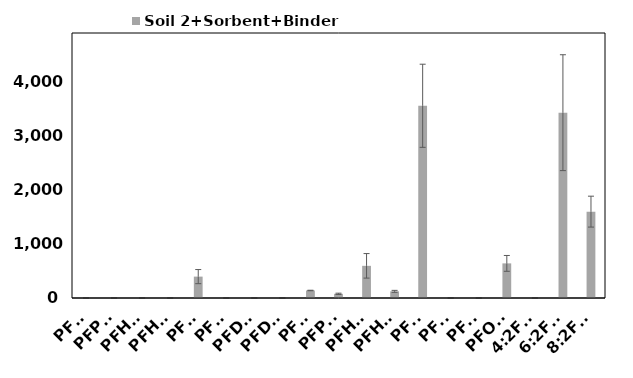
| Category | Soil 2+Sorbent+Binder |
|---|---|
| PFBA | 0 |
| PFPeA | 0 |
| PFHxA | 0 |
| PFHpA | 0 |
| PFOA | 395.364 |
| PFNA | 0 |
| PFDA | 0 |
| PFDoA | 0 |
| PFBS | 138.78 |
| PFPeS | 77.537 |
| PFHxS | 594.71 |
| PFHpS | 123.27 |
| PFOS | 3554.431 |
| PFNS | 0 |
| PFDS | 0 |
| PFOSA | 640.083 |
| 4:2FTS | 0 |
| 6:2FTS | 3426.712 |
| 8:2FTS | 1596.98 |